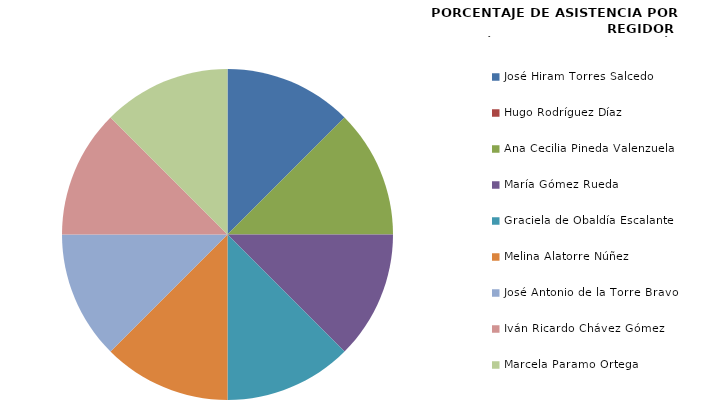
| Category | Series 0 |
|---|---|
| José Hiram Torres Salcedo | 100 |
| Hugo Rodríguez Díaz | 0 |
| Ana Cecilia Pineda Valenzuela | 100 |
| María Gómez Rueda | 100 |
| Graciela de Obaldía Escalante | 100 |
| Melina Alatorre Núñez | 100 |
| José Antonio de la Torre Bravo | 100 |
| Iván Ricardo Chávez Gómez | 100 |
| Marcela Paramo Ortega | 100 |